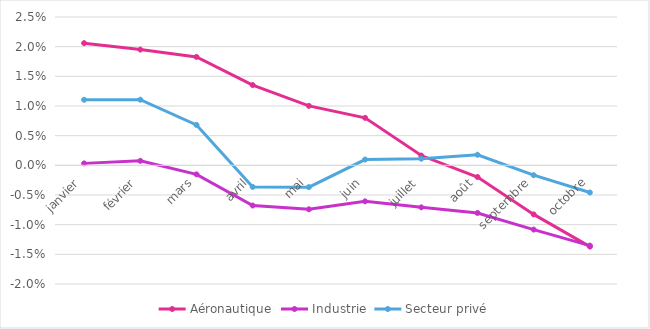
| Category | Aéronautique | Industrie | Secteur privé |
|---|---|---|---|
| janvier | 0.021 | 0 | 0.011 |
| février | 0.02 | 0.001 | 0.011 |
| mars | 0.018 | -0.002 | 0.007 |
| avril | 0.014 | -0.007 | -0.004 |
| mai | 0.01 | -0.007 | -0.004 |
| juin | 0.008 | -0.006 | 0.001 |
| juillet | 0.002 | -0.007 | 0.001 |
| août | -0.002 | -0.008 | 0.002 |
| septembre | -0.008 | -0.011 | -0.002 |
| octobre | -0.014 | -0.014 | -0.005 |